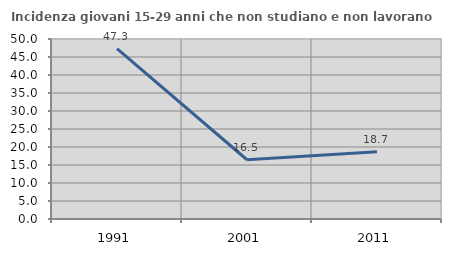
| Category | Incidenza giovani 15-29 anni che non studiano e non lavorano  |
|---|---|
| 1991.0 | 47.329 |
| 2001.0 | 16.456 |
| 2011.0 | 18.653 |